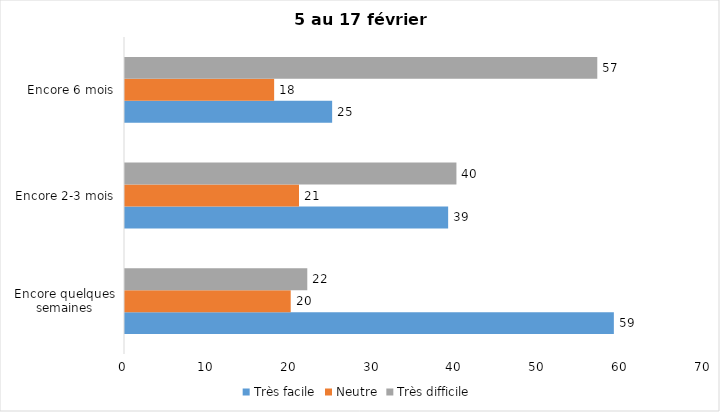
| Category | Très facile | Neutre | Très difficile |
|---|---|---|---|
| Encore quelques semaines | 59 | 20 | 22 |
| Encore 2-3 mois | 39 | 21 | 40 |
| Encore 6 mois | 25 | 18 | 57 |